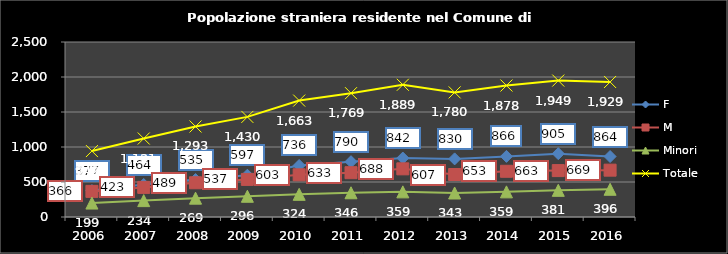
| Category | F | M | Minori | Totale |
|---|---|---|---|---|
| 2006.0 | 377 | 366 | 199 | 942 |
| 2007.0 | 464 | 423 | 234 | 1121 |
| 2008.0 | 535 | 489 | 269 | 1293 |
| 2009.0 | 597 | 537 | 296 | 1430 |
| 2010.0 | 736 | 603 | 324 | 1663 |
| 2011.0 | 790 | 633 | 346 | 1769 |
| 2012.0 | 842 | 688 | 359 | 1889 |
| 2013.0 | 830 | 607 | 343 | 1780 |
| 2014.0 | 866 | 653 | 359 | 1878 |
| 2015.0 | 905 | 663 | 381 | 1949 |
| 2016.0 | 864 | 669 | 396 | 1929 |